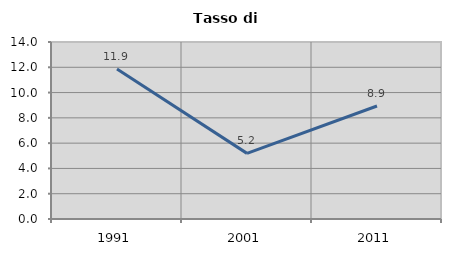
| Category | Tasso di disoccupazione   |
|---|---|
| 1991.0 | 11.856 |
| 2001.0 | 5.191 |
| 2011.0 | 8.939 |